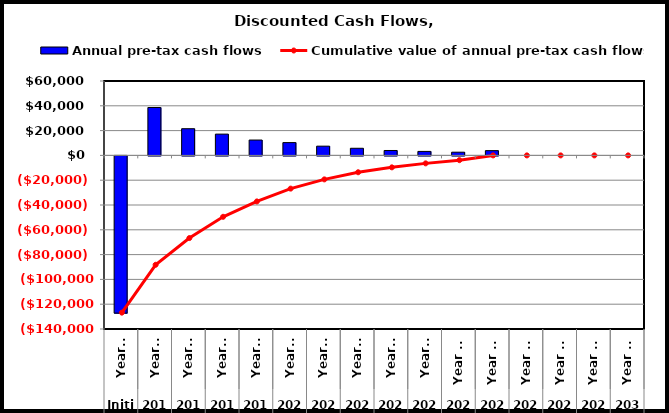
| Category | Annual pre-tax cash flows |
|---|---|
| 0 | -126812 |
| 1 | 38611.524 |
| 2 | 21527.524 |
| 3 | 17161.746 |
| 4 | 12392.356 |
| 5 | 10326.964 |
| 6 | 7444.705 |
| 7 | 5752.879 |
| 8 | 3956.209 |
| 9 | 3212.951 |
| 10 | 2584.162 |
| 11 | 3840.599 |
| 12 | 0 |
| 13 | 0 |
| 14 | 0 |
| 15 | 0 |